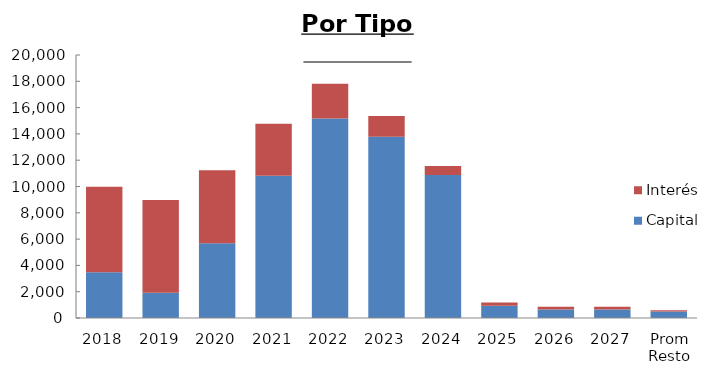
| Category | Capital | Interés |
|---|---|---|
| 2018 | 3472.931 | 6510.474 |
| 2019 | 1916.516 | 7063.985 |
| 2020 | 5685.148 | 5549.132 |
| 2021 | 10809.725 | 3956.801 |
| 2022 | 15169.486 | 2643.449 |
| 2023 | 13777.76 | 1584.904 |
| 2024 | 10877.215 | 682.089 |
| 2025 | 935.56 | 239.588 |
| 2026 | 647.421 | 217.057 |
| 2027 | 651.696 | 205.747 |
| Prom Resto | 501.926 | 82.603 |